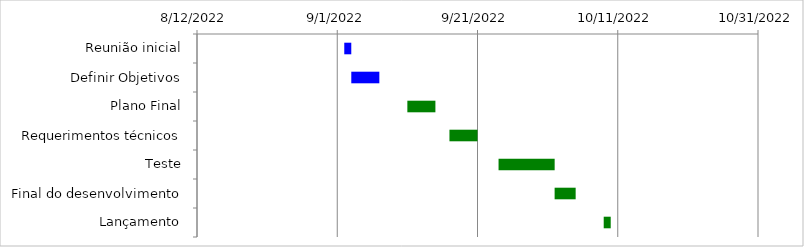
| Category | Iniciado | Dias |
|---|---|---|
| Reunião inicial | 9/2/22 | 1 |
| Definir Objetivos | 9/3/22 | 4 |
| Plano Final | 9/11/22 | 4 |
| Requerimentos técnicos | 9/17/22 | 4 |
| Teste | 9/24/22 | 8 |
| Final do desenvolvimento | 10/2/22 | 3 |
| Lançamento | 10/9/22 | 1 |